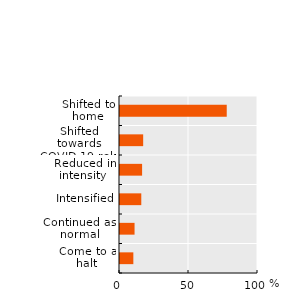
| Category | % |
|---|---|
| Come to a halt | 9.668 |
| Continued as normal | 10.547 |
| Intensified | 15.43 |
| Reduced in intensity  | 16.016 |
| Shifted towards
COVID-19-related topics | 16.797 |
| Shifted to home | 77.344 |